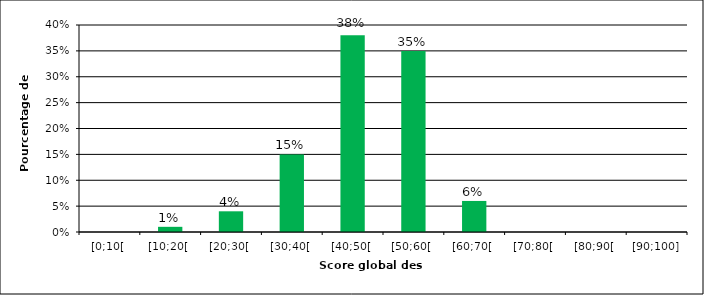
| Category | Series 1 |
|---|---|
| [0;10[ | 0 |
| [10;20[ | 0.01 |
| [20;30[ | 0.04 |
| [30;40[ | 0.15 |
| [40;50[ | 0.38 |
| [50;60[ | 0.35 |
| [60;70[ | 0.06 |
| [70;80[ | 0 |
| [80;90[ | 0 |
| [90;100] | 0 |